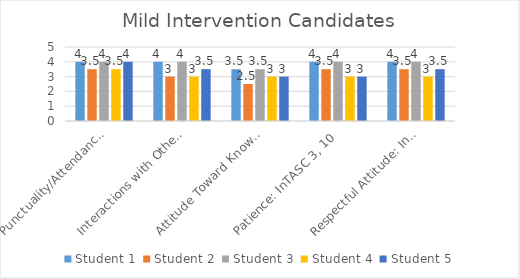
| Category | Student 1 | Student 2 | Student 3 | Student 4 | Student 5 |
|---|---|---|---|---|---|
| Punctuality/Attendance: InTASC 1, 9 | 4 | 3.5 | 4 | 3.5 | 4 |
| Interactions with Others: InTASC 3, 7, 10 | 4 | 3 | 4 | 3 | 3.5 |
| Attitude Toward Knowledge and Learning: InTASC 1, 4, 5, 9, 10 | 3.5 | 2.5 | 3.5 | 3 | 3 |
| Patience: InTASC 3, 10 | 4 | 3.5 | 4 | 3 | 3 |
| Respectful Attitude: InTASC 3, 7, 10 | 4 | 3.5 | 4 | 3 | 3.5 |